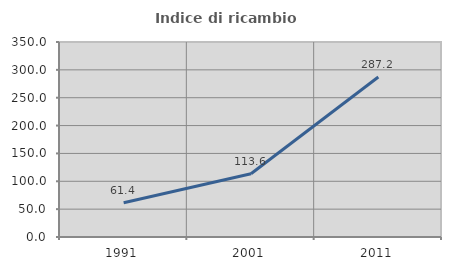
| Category | Indice di ricambio occupazionale  |
|---|---|
| 1991.0 | 61.364 |
| 2001.0 | 113.636 |
| 2011.0 | 287.179 |